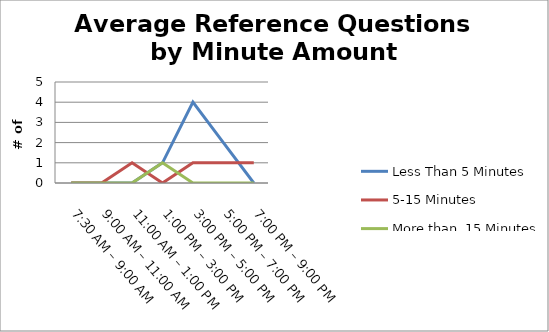
| Category | Less Than 5 Minutes | 5-15 Minutes | More than  15 Minutes |
|---|---|---|---|
| 7:30 AM – 9:00 AM | 0 | 0 | 0 |
| 9:00 AM – 11:00 AM | 0 | 0 | 0 |
| 11:00 AM – 1:00 PM | 0 | 1 | 0 |
| 1:00 PM – 3:00 PM | 1 | 0 | 1 |
| 3:00 PM – 5:00 PM | 4 | 1 | 0 |
| 5:00 PM – 7:00 PM | 2 | 1 | 0 |
| 7:00 PM – 9:00 PM | 0 | 1 | 0 |